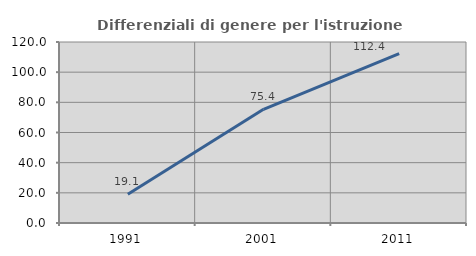
| Category | Differenziali di genere per l'istruzione superiore |
|---|---|
| 1991.0 | 19.077 |
| 2001.0 | 75.385 |
| 2011.0 | 112.356 |